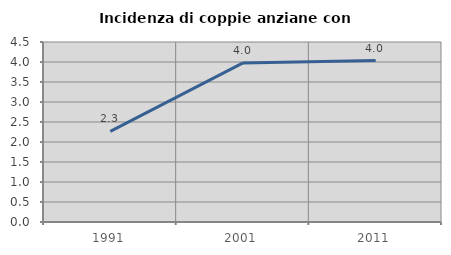
| Category | Incidenza di coppie anziane con figli |
|---|---|
| 1991.0 | 2.267 |
| 2001.0 | 3.977 |
| 2011.0 | 4.036 |